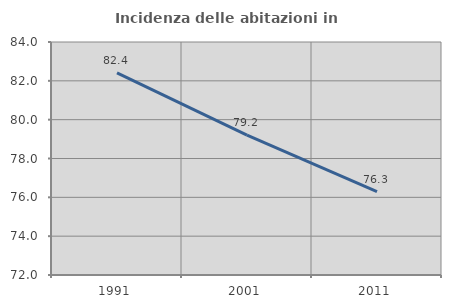
| Category | Incidenza delle abitazioni in proprietà  |
|---|---|
| 1991.0 | 82.405 |
| 2001.0 | 79.2 |
| 2011.0 | 76.298 |